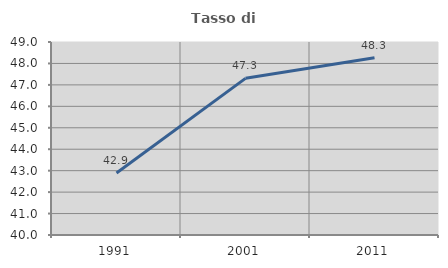
| Category | Tasso di occupazione   |
|---|---|
| 1991.0 | 42.892 |
| 2001.0 | 47.305 |
| 2011.0 | 48.268 |